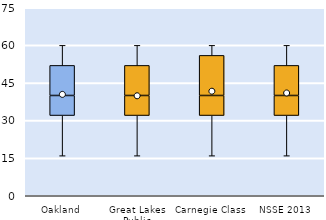
| Category | 25th | 50th | 75th |
|---|---|---|---|
| Oakland | 32 | 8 | 12 |
| Great Lakes Public | 32 | 8 | 12 |
| Carnegie Class | 32 | 8 | 16 |
| NSSE 2013 | 32 | 8 | 12 |